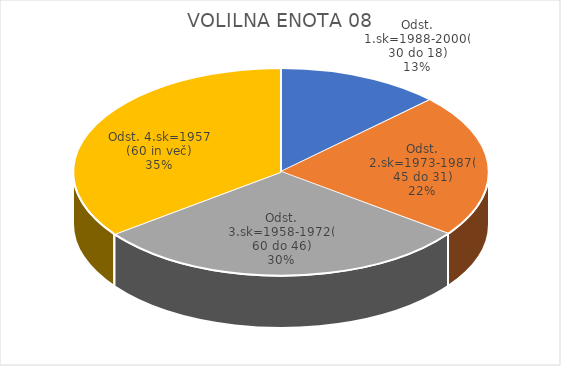
| Category | VOLILNA ENOTA 08 |
|---|---|
| Odst. 1.sk=1988-2000(30 do 18) | 6.23 |
| Odst. 2.sk=1973-1987(45 do 31) | 10.93 |
| Odst. 3.sk=1958-1972(60 do 46) | 14.45 |
| Odst. 4.sk=1957 (60 in več) | 17.19 |